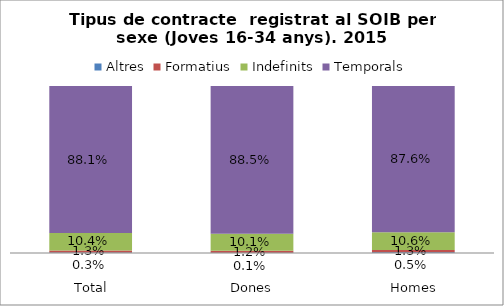
| Category | Altres | Formatius | Indefinits | Temporals |
|---|---|---|---|---|
| 
Total | 0.003 | 0.013 | 0.104 | 0.881 |
| 
Dones | 0.001 | 0.012 | 0.101 | 0.885 |
| 
Homes | 0.005 | 0.013 | 0.106 | 0.876 |